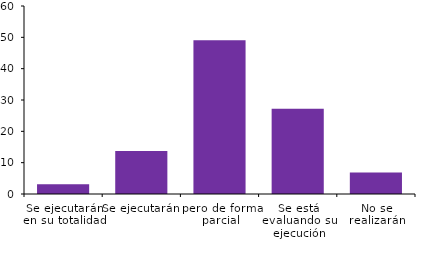
| Category | Respuestas |
|---|---|
| 0 | 3.125 |
| 1 | 13.75 |
| 2 | 49.062 |
| 3 | 27.187 |
| 4 | 6.875 |